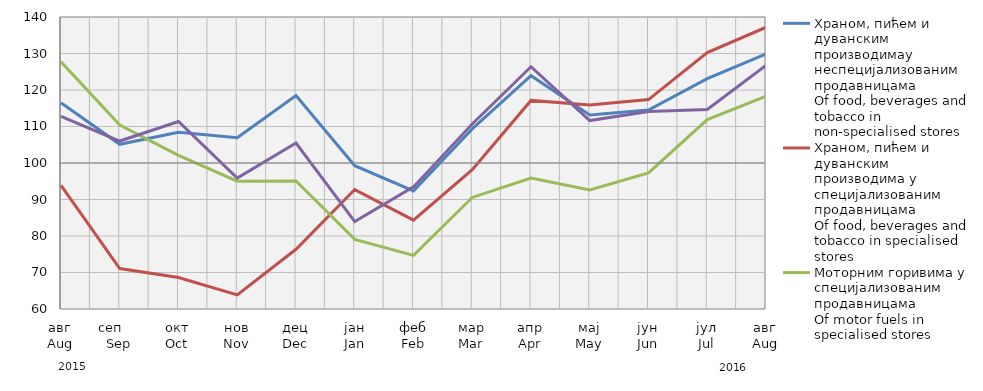
| Category | Храном, пићем и дуванским производимау неспецијализованим продавницама
Of food, beverages and tobacco in non-specialised stores
 | Храном, пићем и дуванским производима у специјализовaним продавницама
Of food, beverages and tobacco in specialised stores | Моторним горивима у специјализованим продавницама
Of motor fuels in specialised stores | Остала
Other |
|---|---|---|---|---|
| авг
Aug | 116.519 | 93.864 | 127.707 | 112.769 |
| сеп     Sep | 105.123 | 71.088 | 110.411 | 106.02 |
| окт
Oct | 108.393 | 68.621 | 102.068 | 111.365 |
| нов
Nov | 106.938 | 63.847 | 95.032 | 95.869 |
| дец
Dec | 118.498 | 76.368 | 95.084 | 105.475 |
| јан
Jan | 99.255 | 92.722 | 79.068 | 83.94 |
| феб
Feb | 92.363 | 84.339 | 74.7 | 93.451 |
| мар
Mar | 109.349 | 98.183 | 90.564 | 110.695 |
| апр
Apr | 123.935 | 117.147 | 95.897 | 126.373 |
| мај
May | 113.15 | 115.884 | 92.592 | 111.621 |
| јун
Jun | 114.503 | 117.373 | 97.274 | 114.134 |
| јул
Jul | 123.119 | 130.235 | 111.897 | 114.647 |
| авг
Aug | 129.897 | 137.173 | 118.321 | 126.728 |